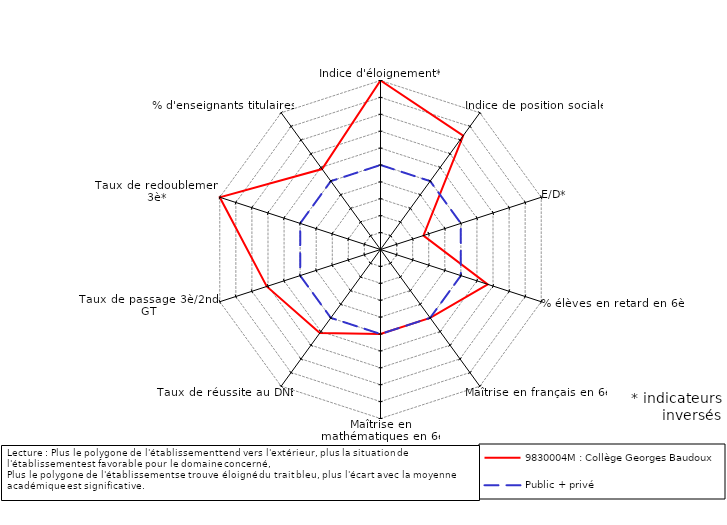
| Category | 9830004M : Collège Georges Baudoux | Public + privé |
|---|---|---|
| Indice d'éloignement* | 5 | 0 |
| Indice de position sociale | 3.323 | 0 |
| E/D* | -2.327 | 0 |
| % élèves en retard en 6è* | 1.674 | 0 |
| Maîtrise en français en 6è | 0 | 0 |
| Maîtrise en mathématiques en 6è | 0 | 0 |
| Taux de réussite au DNB | 1.106 | 0 |
| Taux de passage 3è/2nde GT | 2.077 | 0 |
| Taux de redoublement 3è* | 5 | 0 |
| % d'enseignants titulaires | 0.883 | 0 |